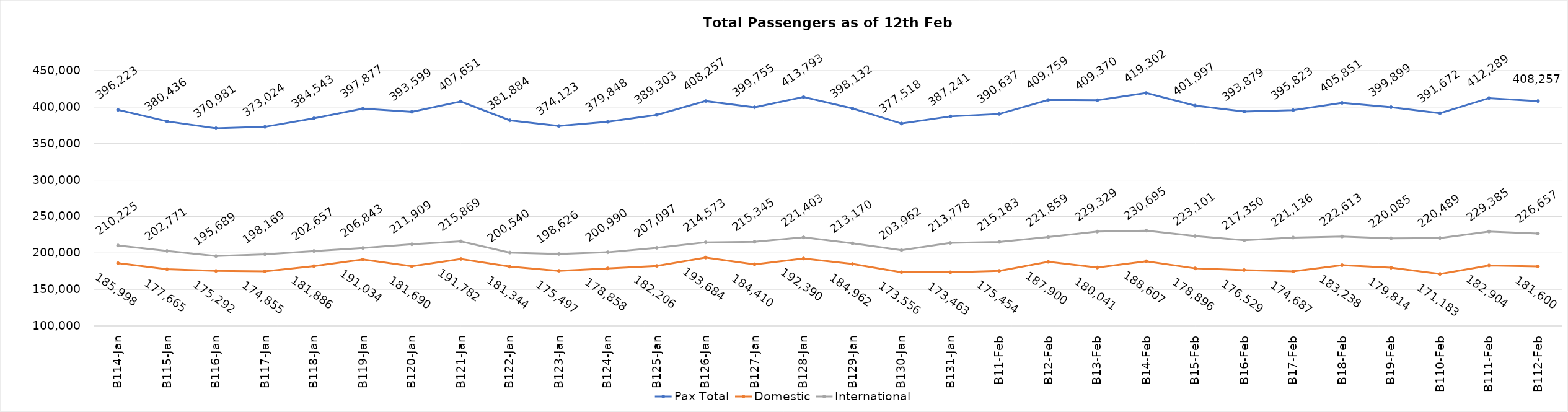
| Category | Pax Total | Domestic | International |
|---|---|---|---|
| 2024-01-14 | 396223 | 185998 | 210225 |
| 2024-01-15 | 380436 | 177665 | 202771 |
| 2024-01-16 | 370981 | 175292 | 195689 |
| 2024-01-17 | 373024 | 174855 | 198169 |
| 2024-01-18 | 384543 | 181886 | 202657 |
| 2024-01-19 | 397877 | 191034 | 206843 |
| 2024-01-20 | 393599 | 181690 | 211909 |
| 2024-01-21 | 407651 | 191782 | 215869 |
| 2024-01-22 | 381884 | 181344 | 200540 |
| 2024-01-23 | 374123 | 175497 | 198626 |
| 2024-01-24 | 379848 | 178858 | 200990 |
| 2024-01-25 | 389303 | 182206 | 207097 |
| 2024-01-26 | 408257 | 193684 | 214573 |
| 2024-01-27 | 399755 | 184410 | 215345 |
| 2024-01-28 | 413793 | 192390 | 221403 |
| 2024-01-29 | 398132 | 184962 | 213170 |
| 2024-01-30 | 377518 | 173556 | 203962 |
| 2024-01-31 | 387241 | 173463 | 213778 |
| 2024-02-01 | 390637 | 175454 | 215183 |
| 2024-02-02 | 409759 | 187900 | 221859 |
| 2024-02-03 | 409370 | 180041 | 229329 |
| 2024-02-04 | 419302 | 188607 | 230695 |
| 2024-02-05 | 401997 | 178896 | 223101 |
| 2024-02-06 | 393879 | 176529 | 217350 |
| 2024-02-07 | 395823 | 174687 | 221136 |
| 2024-02-08 | 405851 | 183238 | 222613 |
| 2024-02-09 | 399899 | 179814 | 220085 |
| 2024-02-10 | 391672 | 171183 | 220489 |
| 2024-02-11 | 412289 | 182904 | 229385 |
| 2024-02-12 | 408257 | 181600 | 226657 |